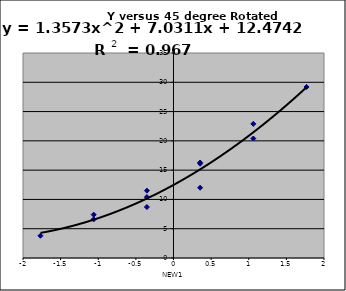
| Category | Y |
|---|---|
| -1.7677669529663689 | 3.8 |
| -1.0606601717798212 | 6.6 |
| -0.3535533905932737 | 8.7 |
| 0.35355339059327395 | 12 |
| -1.0606601717798214 | 7.4 |
| -0.3535533905932738 | 11.5 |
| 0.3535533905932738 | 16.3 |
| 1.0606601717798214 | 20.4 |
| -0.35355339059327395 | 10.4 |
| 0.3535533905932737 | 16.1 |
| 1.0606601717798212 | 22.9 |
| 1.7677669529663689 | 29.2 |